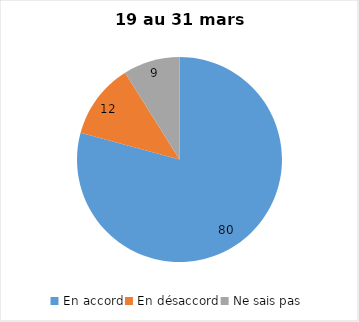
| Category | Series 0 |
|---|---|
| En accord | 80 |
| En désaccord | 12 |
| Ne sais pas | 9 |